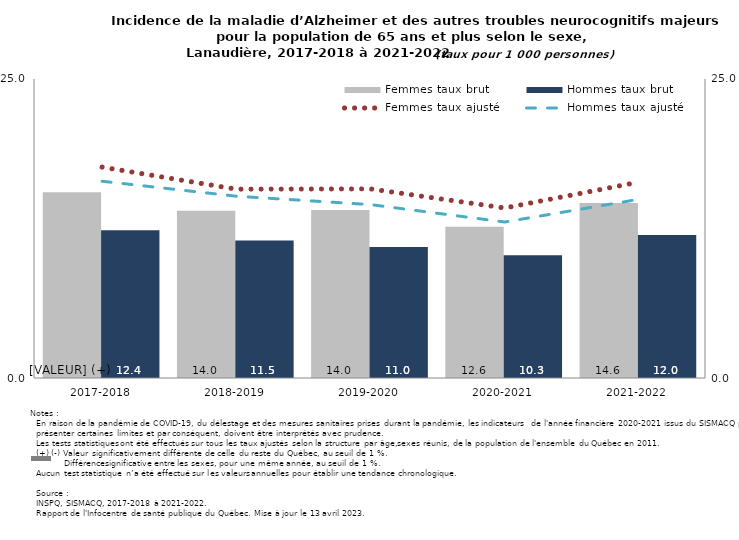
| Category | Femmes taux brut | Hommes taux brut |
|---|---|---|
| 2017-2018 | 15.533 | 12.359 |
| 2018-2019 | 13.975 | 11.493 |
| 2019-2020 | 14.044 | 10.957 |
| 2020-2021 | 12.64 | 10.26 |
| 2021-2022 | 14.626 | 11.955 |